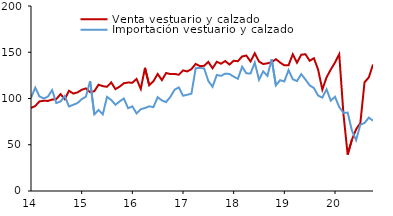
| Category | Venta vestuario y calzado | Importación vestuario y calzado |
|---|---|---|
| 2014-01-01 | 89.792 | 100.634 |
| 2014-02-01 | 91.849 | 111.7 |
| 2014-03-01 | 96.876 | 102.336 |
| 2014-04-01 | 97.545 | 99.997 |
| 2014-05-01 | 97.385 | 102.011 |
| 2014-06-01 | 98.815 | 109.094 |
| 2014-07-01 | 99.405 | 95.105 |
| 2014-08-01 | 104.749 | 96.833 |
| 2014-09-01 | 99.285 | 102.645 |
| 2014-10-01 | 108.306 | 91.377 |
| 2014-11-01 | 105.376 | 93.226 |
| 2014-12-01 | 106.547 | 95.041 |
| 2015-01-01 | 109.412 | 99.26 |
| 2015-02-01 | 110.927 | 101.936 |
| 2015-03-01 | 106.825 | 118.827 |
| 2015-04-01 | 107.849 | 82.817 |
| 2015-05-01 | 114.966 | 87.618 |
| 2015-06-01 | 113.362 | 82.851 |
| 2015-07-01 | 112.629 | 101.689 |
| 2015-08-01 | 117.369 | 98.441 |
| 2015-09-01 | 110.162 | 93.203 |
| 2015-10-01 | 112.853 | 96.932 |
| 2015-11-01 | 116.529 | 99.954 |
| 2015-12-01 | 117.258 | 89.431 |
| 2016-01-01 | 117.026 | 91.536 |
| 2016-02-01 | 121.154 | 83.89 |
| 2016-03-01 | 110.39 | 88.469 |
| 2016-04-01 | 133.147 | 89.707 |
| 2016-05-01 | 114.284 | 91.537 |
| 2016-06-01 | 118.714 | 90.689 |
| 2016-07-01 | 126.526 | 101.453 |
| 2016-08-01 | 119.879 | 97.886 |
| 2016-09-01 | 127.555 | 96.145 |
| 2016-10-01 | 126.432 | 101.725 |
| 2016-11-01 | 126.615 | 109.438 |
| 2016-12-01 | 125.629 | 111.983 |
| 2017-01-01 | 130.357 | 103.033 |
| 2017-02-01 | 129.261 | 104.031 |
| 2017-03-01 | 131.782 | 105.25 |
| 2017-04-01 | 137.414 | 132.706 |
| 2017-05-01 | 135.023 | 133.089 |
| 2017-06-01 | 135.325 | 132.519 |
| 2017-07-01 | 139.613 | 119.017 |
| 2017-08-01 | 132.653 | 112.671 |
| 2017-09-01 | 139.697 | 125.441 |
| 2017-10-01 | 137.591 | 124.468 |
| 2017-11-01 | 140.511 | 126.909 |
| 2017-12-01 | 136.673 | 126.551 |
| 2018-01-01 | 140.776 | 123.692 |
| 2018-02-01 | 140.325 | 121.246 |
| 2018-03-01 | 145.449 | 134.319 |
| 2018-04-01 | 146.434 | 127.237 |
| 2018-05-01 | 140.045 | 126.992 |
| 2018-06-01 | 148.887 | 138.809 |
| 2018-07-01 | 139.928 | 120.212 |
| 2018-08-01 | 137.277 | 129.285 |
| 2018-09-01 | 138.036 | 124.476 |
| 2018-10-01 | 139.255 | 142.491 |
| 2018-11-01 | 142.513 | 114.208 |
| 2018-12-01 | 138.916 | 119.799 |
| 2019-01-01 | 135.848 | 118.448 |
| 2019-02-01 | 135.937 | 130.725 |
| 2019-03-01 | 147.841 | 120.785 |
| 2019-04-01 | 138.733 | 118.859 |
| 2019-05-01 | 147.305 | 126.387 |
| 2019-06-01 | 147.879 | 120.546 |
| 2019-07-01 | 140.774 | 114.17 |
| 2019-08-01 | 143.561 | 111.351 |
| 2019-09-01 | 131.225 | 103.132 |
| 2019-10-01 | 109.596 | 100.979 |
| 2019-11-01 | 122.927 | 109.901 |
| 2019-12-01 | 131.346 | 97.679 |
| 2020-01-01 | 138.871 | 101.874 |
| 2020-02-01 | 147.899 | 90.793 |
| 2020-03-01 | 83.331 | 84.484 |
| 2020-04-01 | 39.338 | 84.757 |
| 2020-05-01 | 55.428 | 65.414 |
| 2020-06-01 | 66.721 | 55.018 |
| 2020-07-01 | 73.383 | 71.717 |
| 2020-08-01 | 117.568 | 73.487 |
| 2020-09-01 | 122.676 | 79.342 |
| 2020-10-01 | 136.718 | 76.022 |